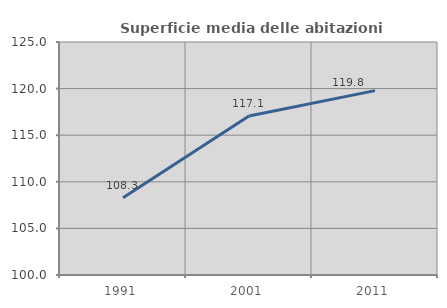
| Category | Superficie media delle abitazioni occupate |
|---|---|
| 1991.0 | 108.277 |
| 2001.0 | 117.054 |
| 2011.0 | 119.782 |